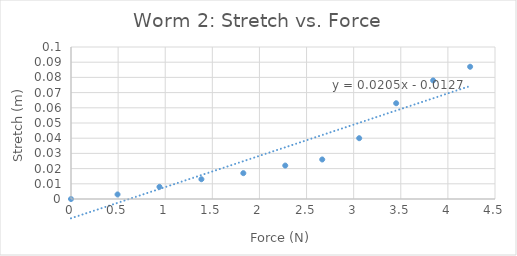
| Category | Series 0 |
|---|---|
| 0.0 | 0 |
| 0.49403159999999996 | 0.003 |
| 0.9390132 | 0.008 |
| 1.3839948 | 0.013 |
| 1.8289764 | 0.017 |
| 2.2739580000000004 | 0.022 |
| 2.666358 | 0.026 |
| 3.0587580000000005 | 0.04 |
| 3.4511580000000004 | 0.063 |
| 3.8435580000000007 | 0.078 |
| 4.235958 | 0.087 |